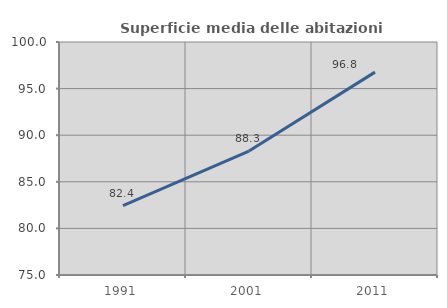
| Category | Superficie media delle abitazioni occupate |
|---|---|
| 1991.0 | 82.441 |
| 2001.0 | 88.305 |
| 2011.0 | 96.768 |